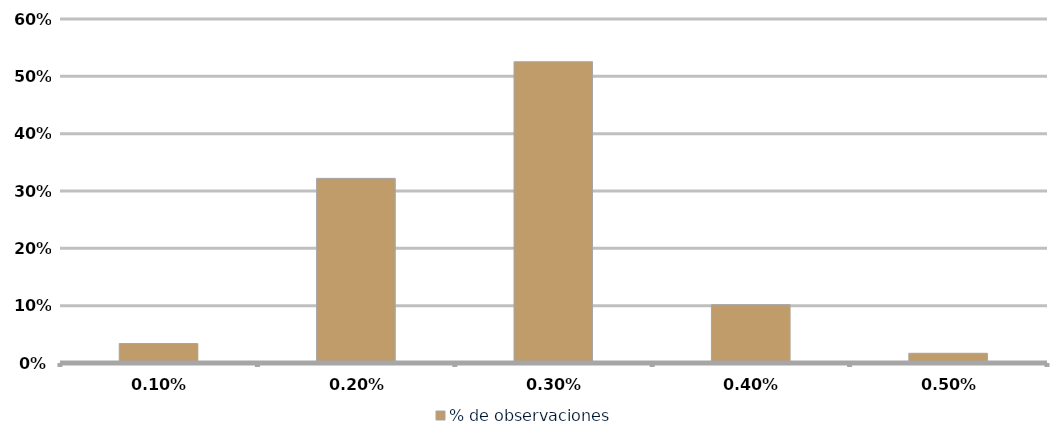
| Category | % de observaciones  |
|---|---|
| 0.001 | 0.034 |
| 0.002 | 0.322 |
| 0.003 | 0.525 |
| 0.004 | 0.102 |
| 0.005 | 0.017 |